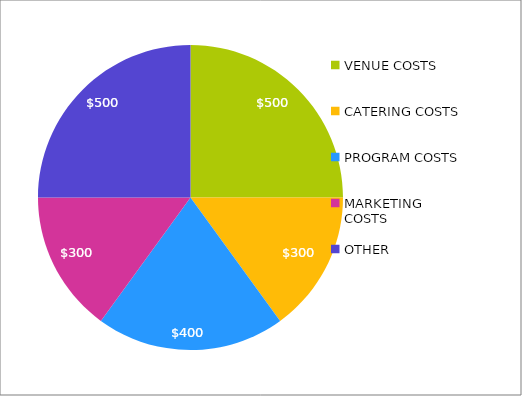
| Category | Series 0 |
|---|---|
| VENUE COSTS | 500 |
| CATERING COSTS | 300 |
| PROGRAM COSTS | 400 |
| MARKETING COSTS | 300 |
| OTHER | 500 |